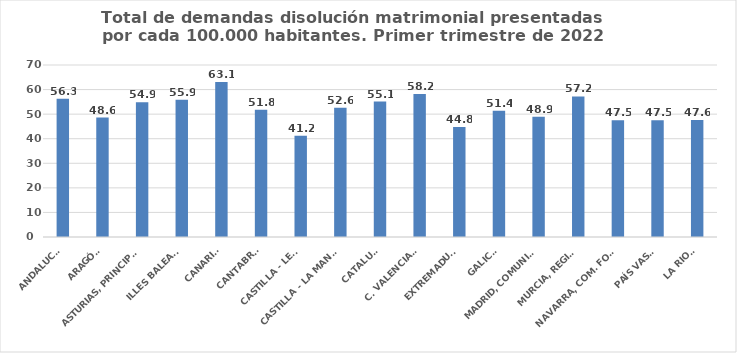
| Category | Series 0 |
|---|---|
| ANDALUCÍA | 56.304 |
| ARAGÓN | 48.591 |
| ASTURIAS, PRINCIPADO | 54.853 |
| ILLES BALEARS | 55.855 |
| CANARIAS | 63.131 |
| CANTABRIA | 51.775 |
| CASTILLA - LEÓN | 41.18 |
| CASTILLA - LA MANCHA | 52.578 |
| CATALUÑA | 55.105 |
| C. VALENCIANA | 58.242 |
| EXTREMADURA | 44.771 |
| GALICIA | 51.354 |
| MADRID, COMUNIDAD | 48.944 |
| MURCIA, REGIÓN | 57.201 |
| NAVARRA, COM. FORAL | 47.467 |
| PAÍS VASCO | 47.526 |
| LA RIOJA | 47.577 |